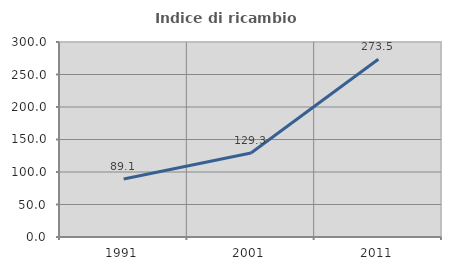
| Category | Indice di ricambio occupazionale  |
|---|---|
| 1991.0 | 89.123 |
| 2001.0 | 129.268 |
| 2011.0 | 273.455 |